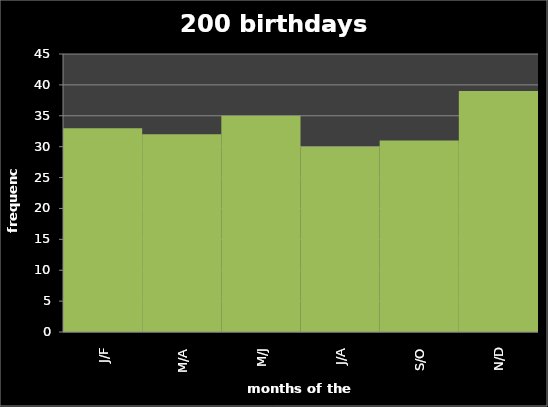
| Category | freq week |
|---|---|
| J/F | 33 |
| M/A | 32 |
| M/J | 35 |
| J/A | 30 |
| S/O | 31 |
| N/D | 39 |